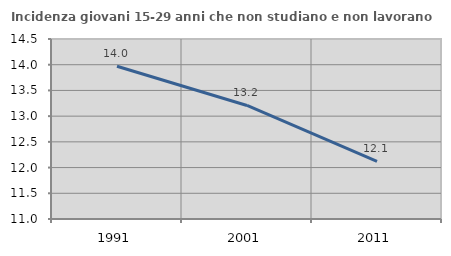
| Category | Incidenza giovani 15-29 anni che non studiano e non lavorano  |
|---|---|
| 1991.0 | 13.97 |
| 2001.0 | 13.208 |
| 2011.0 | 12.121 |